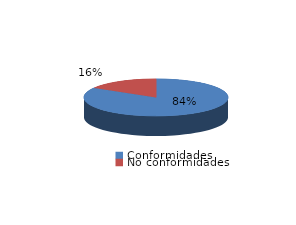
| Category | Series 0 |
|---|---|
| Conformidades | 420 |
| No conformidades | 82 |